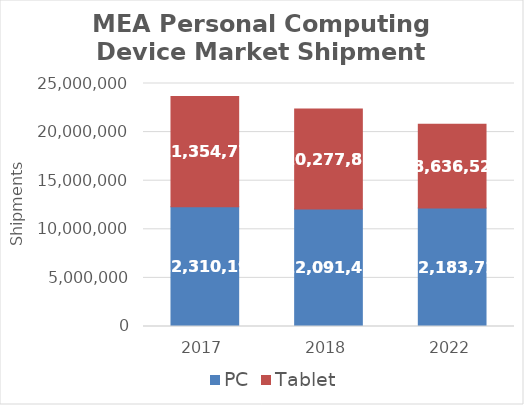
| Category | PC | Tablet |
|---|---|---|
| 2017 | 12310198 | 11354777 |
| 2018 | 12091439 | 10277882 |
| 2022 | 12183714 | 8636521 |